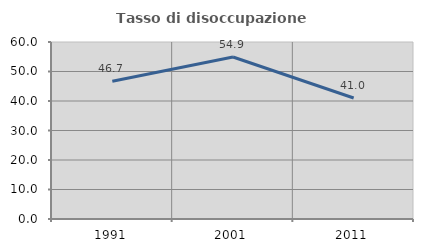
| Category | Tasso di disoccupazione giovanile  |
|---|---|
| 1991.0 | 46.721 |
| 2001.0 | 54.918 |
| 2011.0 | 41.026 |